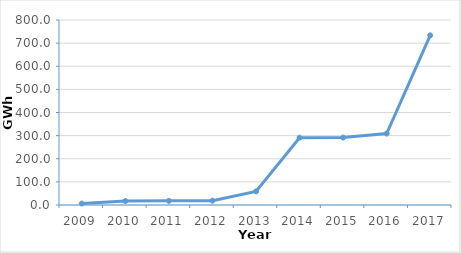
| Category | المجموع  |
|---|---|
| 2009.0 | 6.29 |
| 2010.0 | 17.1 |
| 2011.0 | 17.986 |
| 2012.0 | 18.586 |
| 2013.0 | 58.857 |
| 2014.0 | 291.078 |
| 2015.0 | 291.493 |
| 2016.0 | 309.036 |
| 2017.0 | 733.781 |